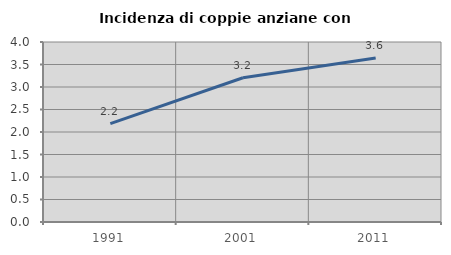
| Category | Incidenza di coppie anziane con figli |
|---|---|
| 1991.0 | 2.187 |
| 2001.0 | 3.206 |
| 2011.0 | 3.642 |